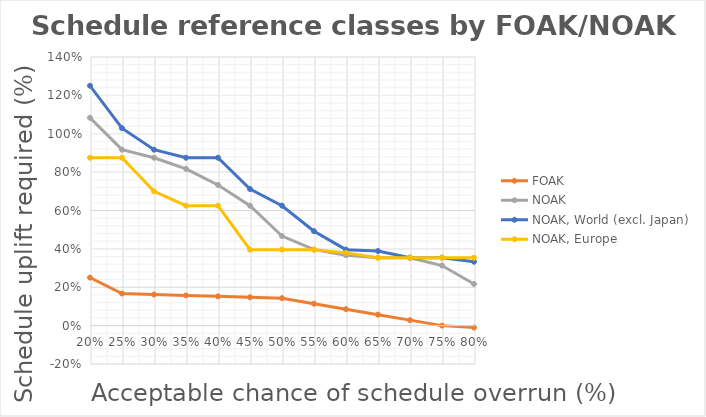
| Category | FOAK | NOAK | NOAK, World (excl. Japan) | NOAK, Europe |
|---|---|---|---|---|
| 0.8 | -0.01 | 0.217 | 0.333 | 0.354 |
| 0.75 | 0 | 0.313 | 0.354 | 0.354 |
| 0.7 | 0.029 | 0.354 | 0.354 | 0.354 |
| 0.65 | 0.057 | 0.354 | 0.389 | 0.354 |
| 0.6 | 0.086 | 0.367 | 0.396 | 0.379 |
| 0.55 | 0.114 | 0.396 | 0.492 | 0.396 |
| 0.5 | 0.143 | 0.467 | 0.625 | 0.396 |
| 0.45 | 0.148 | 0.625 | 0.712 | 0.396 |
| 0.399999999999999 | 0.153 | 0.733 | 0.875 | 0.625 |
| 0.349999999999999 | 0.157 | 0.817 | 0.875 | 0.625 |
| 0.299999999999999 | 0.162 | 0.875 | 0.917 | 0.7 |
| 0.249999999999999 | 0.167 | 0.917 | 1.029 | 0.875 |
| 0.199999999999999 | 0.25 | 1.083 | 1.25 | 0.875 |